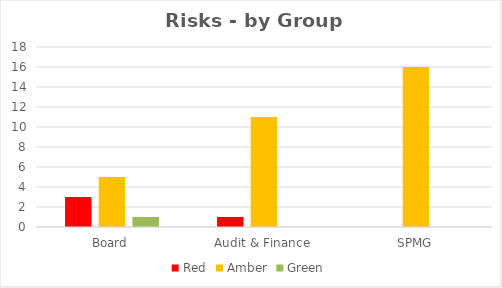
| Category | Red | Amber | Green |
|---|---|---|---|
| Board | 3 | 5 | 1 |
| Audit & Finance | 1 | 11 | 0 |
| SPMG | 0 | 16 | 0 |